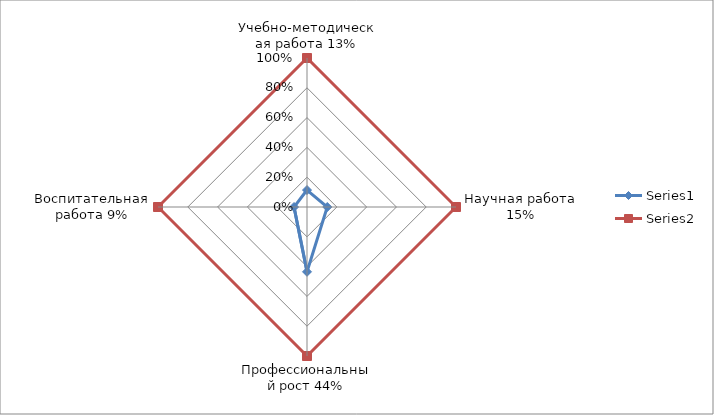
| Category | Series 0 | Series 1 |
|---|---|---|
| Учебно-методическая работа 13% | 0.114 | 1 |
| Научная работа 15% | 0.136 | 1 |
| Профессиональный рост 44% | 0.435 | 1 |
| Воспитательная работа 9% | 0.087 | 1 |